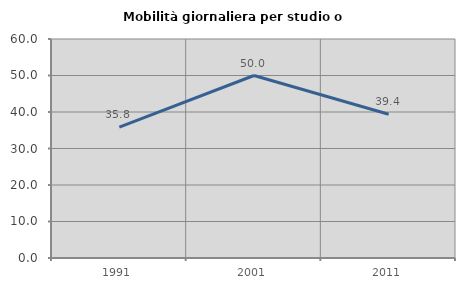
| Category | Mobilità giornaliera per studio o lavoro |
|---|---|
| 1991.0 | 35.849 |
| 2001.0 | 50 |
| 2011.0 | 39.4 |